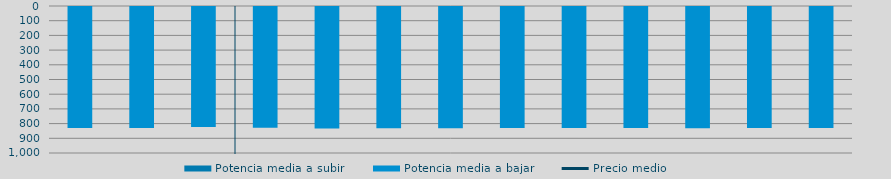
| Category | Potencia media a subir | Potencia media a bajar |
|---|---|---|
| 0 |  | 822.445 |
| 1 |  | 823.829 |
| 2 |  | 816.372 |
| 3 |  | 821.408 |
| 4 |  | 825.952 |
| 5 |  | 824.183 |
| 6 |  | 824.381 |
| 7 |  | 823.337 |
| 8 |  | 823.521 |
| 9 |  | 823.928 |
| 10 |  | 824.328 |
| 11 |  | 822.96 |
| 12 |  | 823.749 |